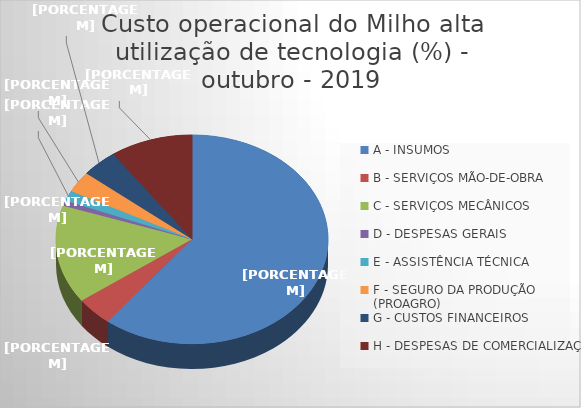
| Category | Series 0 |
|---|---|
| A - INSUMOS | 60.595 |
| B - SERVIÇOS MÃO-DE-OBRA | 4.426 |
| C - SERVIÇOS MECÂNICOS | 15.192 |
| D - DESPESAS GERAIS  | 0.802 |
| E - ASSISTÊNCIA TÉCNICA | 1.62 |
| F - SEGURO DA PRODUÇÃO (PROAGRO) | 3.241 |
| G - CUSTOS FINANCEIROS | 4.294 |
| H - DESPESAS DE COMERCIALIZAÇÃO | 9.829 |